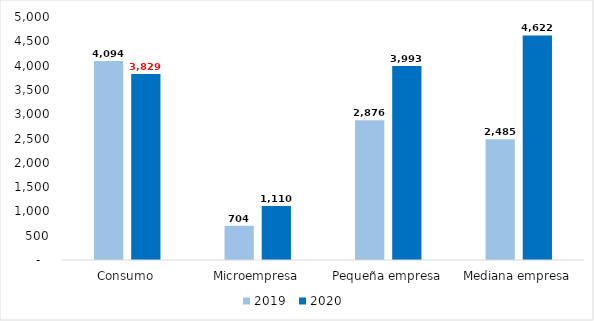
| Category | 2019 | 2020 |
|---|---|---|
| Consumo | 4094.218 | 3828.76 |
| Microempresa | 704.19 | 1109.744 |
| Pequeña empresa | 2876.221 | 3993.313 |
| Mediana empresa | 2485.224 | 4621.502 |